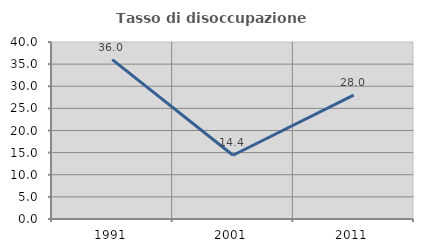
| Category | Tasso di disoccupazione giovanile  |
|---|---|
| 1991.0 | 36.019 |
| 2001.0 | 14.407 |
| 2011.0 | 28 |